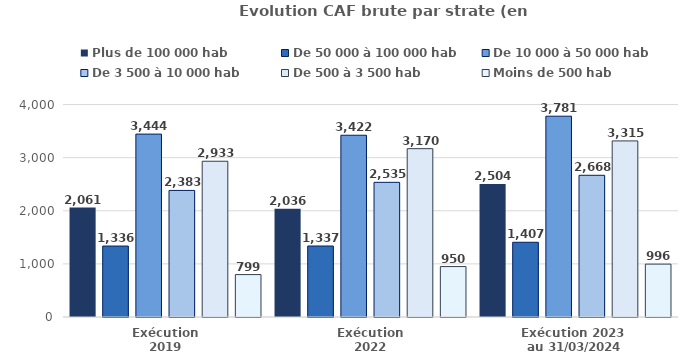
| Category | Plus de 100 000 hab | De 50 000 à 100 000 hab | De 10 000 à 50 000 hab | De 3 500 à 10 000 hab | De 500 à 3 500 hab | Moins de 500 hab |
|---|---|---|---|---|---|---|
| Exécution
2019 | 2060.7 | 1335.7 | 3443.6 | 2383.1 | 2932.6 | 798.7 |
| Exécution
2022 | 2036.2 | 1336.8 | 3422.3 | 2535.4 | 3169.6 | 949.6 |
| Exécution 2023 
au 31/03/2024 | 2504.3 | 1406.9 | 3780.5 | 2668.1 | 3315.4 | 995.8 |